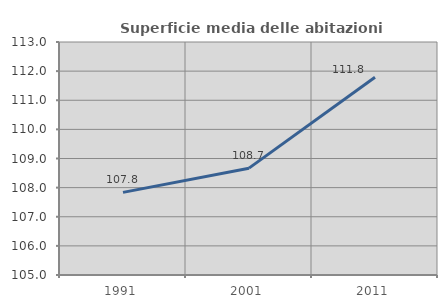
| Category | Superficie media delle abitazioni occupate |
|---|---|
| 1991.0 | 107.836 |
| 2001.0 | 108.668 |
| 2011.0 | 111.792 |